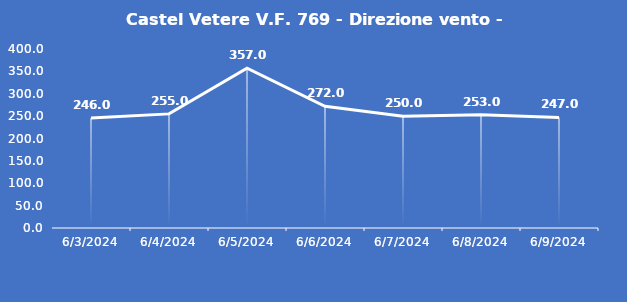
| Category | Castel Vetere V.F. 769 - Direzione vento - Grezzo (°N) |
|---|---|
| 6/3/24 | 246 |
| 6/4/24 | 255 |
| 6/5/24 | 357 |
| 6/6/24 | 272 |
| 6/7/24 | 250 |
| 6/8/24 | 253 |
| 6/9/24 | 247 |